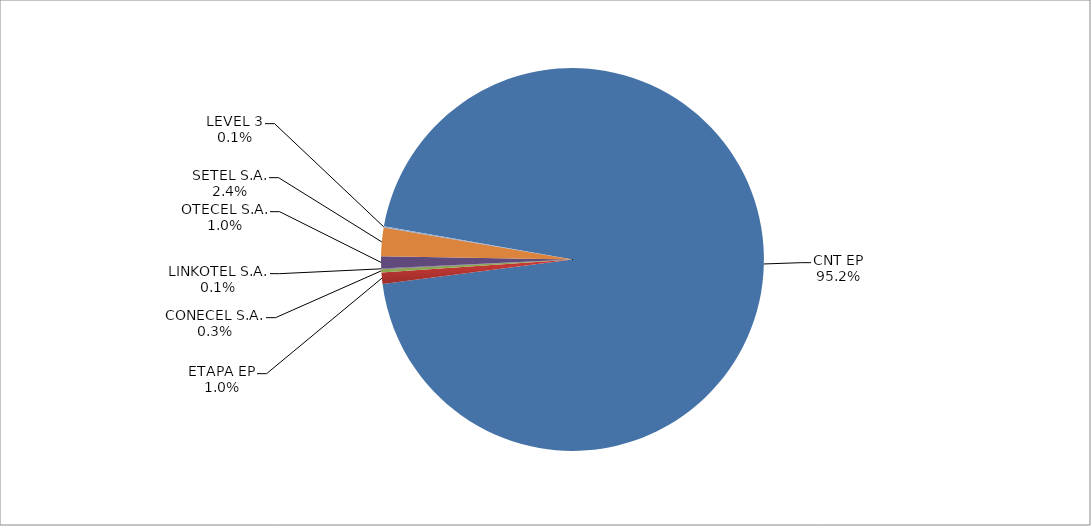
| Category | Series 0 |
|---|---|
| CNT EP | 2571 |
| ETAPA EP | 26 |
| CONECEL S.A. | 7 |
| LINKOTEL S.A. | 2 |
| OTECEL S.A. | 27 |
| SETEL S.A. | 65 |
| LEVEL 3 | 3 |